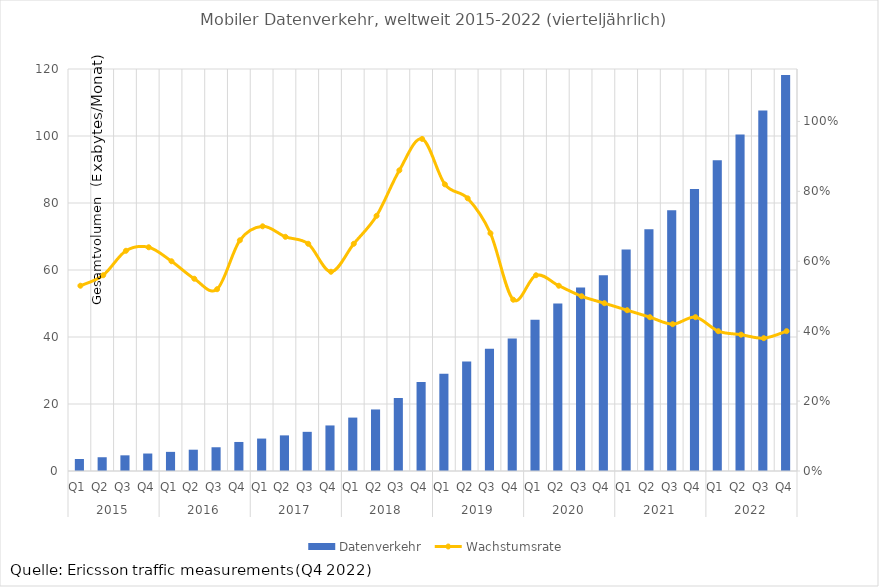
| Category | Datenverkehr |
|---|---|
| 0 | 3.577 |
| 1 | 4.107 |
| 2 | 4.678 |
| 3 | 5.217 |
| 4 | 5.712 |
| 5 | 6.358 |
| 6 | 7.089 |
| 7 | 8.667 |
| 8 | 9.682 |
| 9 | 10.634 |
| 10 | 11.691 |
| 11 | 13.599 |
| 12 | 15.944 |
| 13 | 18.37 |
| 14 | 21.783 |
| 15 | 26.538 |
| 16 | 29.021 |
| 17 | 32.661 |
| 18 | 36.493 |
| 19 | 39.559 |
| 20 | 45.164 |
| 21 | 50.025 |
| 22 | 54.794 |
| 23 | 58.442 |
| 24 | 66.138 |
| 25 | 72.2 |
| 26 | 77.81 |
| 27 | 84.162 |
| 28 | 92.746 |
| 29 | 100.42 |
| 30 | 107.58 |
| 31 | 118.214 |